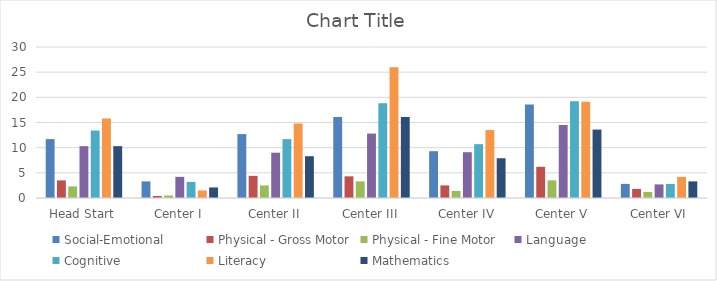
| Category | Social-Emotional | Physical - Gross Motor | Physical - Fine Motor | Language | Cognitive | Literacy | Mathematics |
|---|---|---|---|---|---|---|---|
| Head Start | 11.7 | 3.5 | 2.3 | 10.3 | 13.4 | 15.8 | 10.3 |
| Center I | 3.3 | 0.4 | 0.5 | 4.2 | 3.2 | 1.5 | 2.1 |
| Center II | 12.7 | 4.4 | 2.5 | 9 | 11.7 | 14.8 | 8.3 |
| Center III | 16.1 | 4.3 | 3.3 | 12.8 | 18.8 | 26 | 16.1 |
| Center IV | 9.3 | 2.5 | 1.4 | 9.1 | 10.7 | 13.5 | 7.9 |
| Center V | 18.6 | 6.2 | 3.5 | 14.5 | 19.2 | 19.1 | 13.6 |
| Center VI | 2.8 | 1.8 | 1.2 | 2.7 | 2.8 | 4.2 | 3.3 |